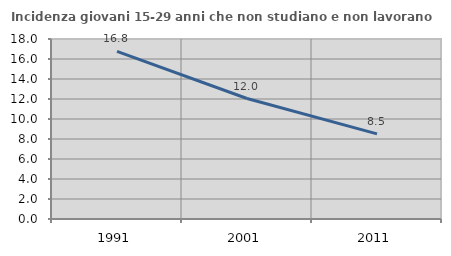
| Category | Incidenza giovani 15-29 anni che non studiano e non lavorano  |
|---|---|
| 1991.0 | 16.77 |
| 2001.0 | 12.048 |
| 2011.0 | 8.511 |